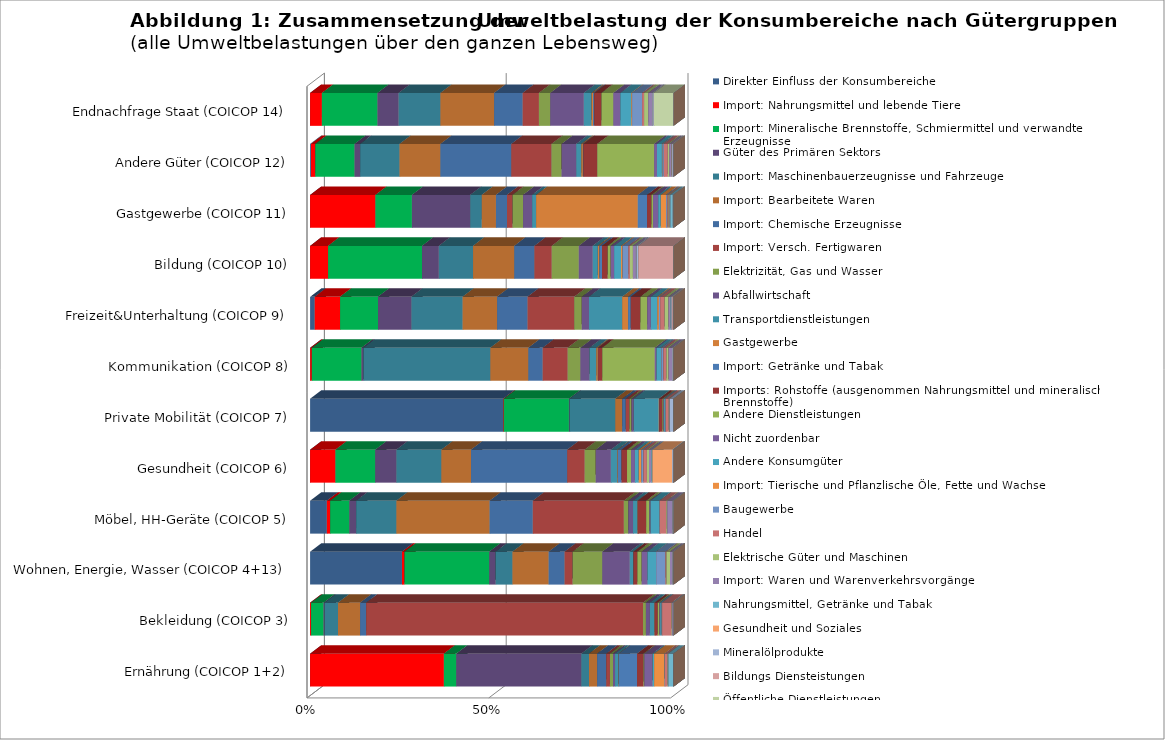
| Category | Direkter Einfluss der Konsumbereiche | Import: Nahrungsmittel und lebende Tiere | Import: Mineralische Brennstoffe, Schmiermittel und verwandte Erzeugnisse | Güter des Primären Sektors | Import: Maschinenbauerzeugnisse und Fahrzeuge | Import: Bearbeitete Waren | Import: Chemische Erzeugnisse | Import: Versch. Fertigwaren | Elektrizität, Gas und Wasser | Abfallwirtschaft | Transportdienstleistungen | Gastgewerbe | Import: Getränke und Tabak | Imports: Rohstoffe (ausgenommen Nahrungsmittel und mineralische Brennstoffe) | Andere Dienstleistungen | Nicht zuordenbar | Andere Konsumgüter | Import: Tierische und Pflanzlische Öle, Fette und Wachse | Baugewerbe | Handel | Elektrische Güter und Maschinen | Import: Waren und Warenverkehrsvorgänge | Nahrungsmittel, Getränke und Tabak | Gesundheit und Soziales | Mineralölprodukte | Bildungs Diensteistungen | Öffentliche Dienstleistungen | Chemikalien und Plastikprodukte | Textilprodukte | Fahrzezuge |
|---|---|---|---|---|---|---|---|---|---|---|---|---|---|---|---|---|---|---|---|---|---|---|---|---|---|---|---|---|---|---|
| Ernährung (COICOP 1+2) | 0 | 0.104 | 0.01 | 0.097 | 0.006 | 0.006 | 0.007 | 0.003 | 0.002 | 0.002 | 0.003 | 0 | 0.014 | 0.005 | 0.001 | 0.006 | 0.001 | 0.008 | 0 | 0.002 | 0 | 0 | 0.004 | 0 | 0 | 0 | 0 | 0 | 0 | 0 |
| Bekleidung (COICOP 3) | 0 | 0 | 0.001 | 0 | 0.001 | 0.001 | 0 | 0.018 | 0 | 0 | 0 | 0 | 0 | 0 | 0 | 0 | 0 | 0 | 0 | 0.001 | 0 | 0 | 0 | 0 | 0 | 0 | 0 | 0 | 0 | 0 |
| Wohnen, Energie, Wasser (COICOP 4+13) | 0.062 | 0.002 | 0.057 | 0.004 | 0.011 | 0.024 | 0.011 | 0.005 | 0.02 | 0.018 | 0.002 | 0 | 0 | 0.003 | 0.003 | 0.004 | 0.006 | 0 | 0.006 | 0.001 | 0.002 | 0.002 | 0 | 0 | 0.001 | 0 | 0 | 0 | 0 | 0 |
| Möbel, HH-Geräte (COICOP 5) | 0.001 | 0 | 0.002 | 0.001 | 0.004 | 0.008 | 0.004 | 0.008 | 0 | 0 | 0 | 0 | 0 | 0.001 | 0 | 0 | 0.001 | 0 | 0 | 0.001 | 0 | 0 | 0 | 0 | 0 | 0 | 0 | 0 | 0 | 0 |
| Gesundheit (COICOP 6) | 0 | 0.005 | 0.008 | 0.004 | 0.009 | 0.006 | 0.018 | 0.003 | 0.002 | 0.003 | 0.001 | 0 | 0.001 | 0.001 | 0.001 | 0.001 | 0.001 | 0 | 0 | 0.001 | 0 | 0 | 0 | 0.004 | 0 | 0 | 0 | 0 | 0 | 0 |
| Private Mobilität (COICOP 7) | 0.065 | 0 | 0.022 | 0 | 0.015 | 0.002 | 0.001 | 0.001 | 0.001 | 0.001 | 0.008 | 0 | 0 | 0.001 | 0 | 0 | 0 | 0 | 0 | 0.001 | 0 | 0 | 0 | 0 | 0.001 | 0 | 0 | 0 | 0 | 0 |
| Kommunikation (COICOP 8) | 0 | 0 | 0.001 | 0 | 0.004 | 0.001 | 0 | 0.001 | 0 | 0 | 0 | 0 | 0 | 0 | 0.001 | 0 | 0 | 0 | 0 | 0 | 0 | 0 | 0 | 0 | 0 | 0 | 0 | 0 | 0 | 0 |
| Freizeit&Unterhaltung (COICOP 9) | 0.001 | 0.004 | 0.006 | 0.005 | 0.008 | 0.006 | 0.005 | 0.008 | 0.001 | 0.001 | 0.005 | 0.001 | 0 | 0.002 | 0.001 | 0.001 | 0.001 | 0 | 0 | 0.001 | 0.001 | 0 | 0 | 0 | 0 | 0 | 0 | 0 | 0 | 0 |
| Bildung (COICOP 10) | 0 | 0.001 | 0.007 | 0.001 | 0.002 | 0.003 | 0.001 | 0.001 | 0.002 | 0.001 | 0 | 0 | 0 | 0 | 0 | 0 | 0.001 | 0 | 0 | 0 | 0 | 0 | 0 | 0 | 0 | 0.003 | 0 | 0 | 0 | 0 |
| Gastgewerbe (COICOP 11) | 0 | 0.01 | 0.006 | 0.009 | 0.002 | 0.002 | 0.002 | 0.001 | 0.002 | 0.001 | 0.001 | 0.016 | 0.001 | 0.001 | 0 | 0.001 | 0 | 0.001 | 0 | 0 | 0 | 0 | 0 | 0 | 0 | 0 | 0 | 0 | 0 | 0 |
| Andere Güter (COICOP 12) | 0 | 0 | 0.004 | 0.001 | 0.004 | 0.004 | 0.007 | 0.004 | 0.001 | 0.002 | 0.001 | 0 | 0 | 0.001 | 0.006 | 0 | 0.001 | 0 | 0 | 0 | 0 | 0 | 0 | 0 | 0 | 0 | 0 | 0 | 0 | 0 |
| Endnachfrage Staat (COICOP 14) | 0 | 0.001 | 0.005 | 0.002 | 0.004 | 0.005 | 0.003 | 0.001 | 0.001 | 0.003 | 0.001 | 0 | 0 | 0.001 | 0.001 | 0.001 | 0.001 | 0 | 0.001 | 0 | 0 | 0 | 0 | 0 | 0 | 0 | 0.002 | 0 | 0 | 0 |